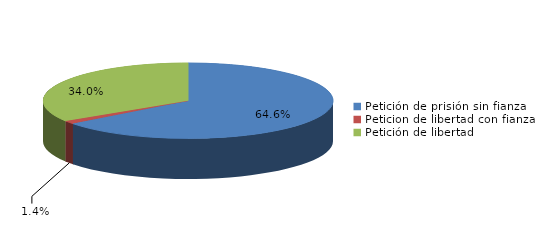
| Category | Series 0 |
|---|---|
| Petición de prisión sin fianza | 93 |
| Peticion de libertad con fianza | 2 |
| Petición de libertad | 49 |